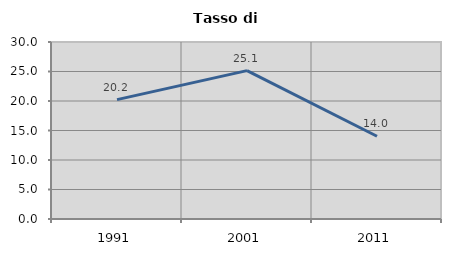
| Category | Tasso di disoccupazione   |
|---|---|
| 1991.0 | 20.235 |
| 2001.0 | 25.149 |
| 2011.0 | 14.031 |